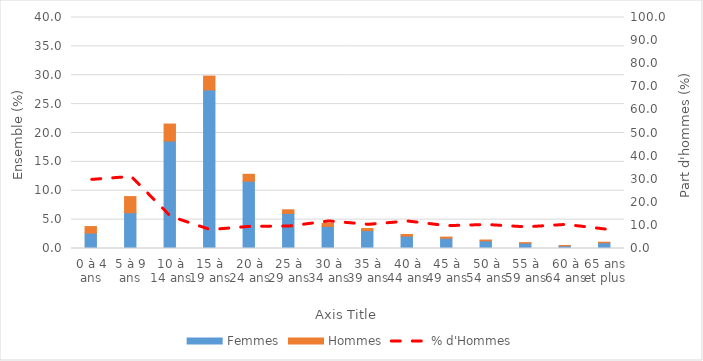
| Category | Femmes | Hommes |
|---|---|---|
| 0 à 4 ans | 2.67 | 1.13 |
| 5 à 9 ans | 6.2 | 2.79 |
| 10 à 14 ans | 18.6 | 2.95 |
| 15 à 19 ans | 27.46 | 2.39 |
| 20 à 24 ans | 11.65 | 1.2 |
| 25 à 29 ans | 6.06 | 0.64 |
| 30 à 34 ans | 3.82 | 0.51 |
| 35 à 39 ans | 3.1 | 0.35 |
| 40 à 44 ans | 2.14 | 0.28 |
| 45 à 49 ans | 1.78 | 0.19 |
| 50 à 54 ans | 1.32 | 0.15 |
| 55 à 59 ans | 0.92 | 0.09 |
| 60 à 64 ans | 0.46 | 0.05 |
| 65 ans et plus | 1 | 0.09 |